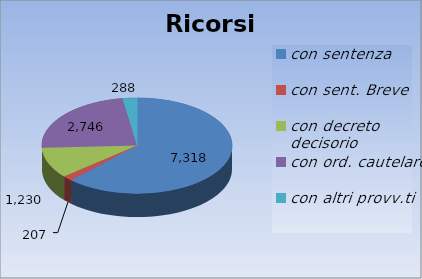
| Category | Ricorsi definiti |
|---|---|
| con sentenza | 7318 |
| con sent. Breve | 207 |
| con decreto decisorio | 1230 |
| con ord. cautelare | 2746 |
| con altri provv.ti | 288 |